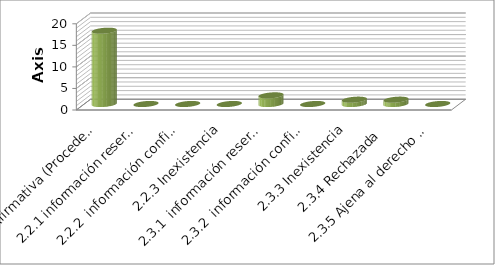
| Category | Series 0 |
|---|---|
| 2.1 Afirmativa (Procedente) | 17 |
| 2.2.1 información reservada | 0 |
| 2.2.2  información confidencial | 0 |
| 2.2.3 Inexistencia | 0 |
| 2.3.1  información reservada | 2 |
| 2.3.2  información confidencial | 0 |
| 2.3.3 Inexistencia | 1 |
| 2.3.4 Rechazada  | 1 |
| 2.3.5 Ajena al derecho de Inf. | 0 |